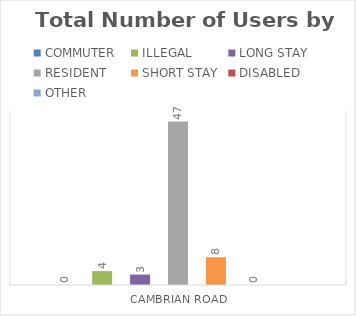
| Category | COMMUTER | ILLEGAL | LONG STAY | RESIDENT | SHORT STAY | DISABLED | OTHER |
|---|---|---|---|---|---|---|---|
| CAMBRIAN ROAD | 0 | 4 | 3 | 47 | 8 | 0 | 0 |